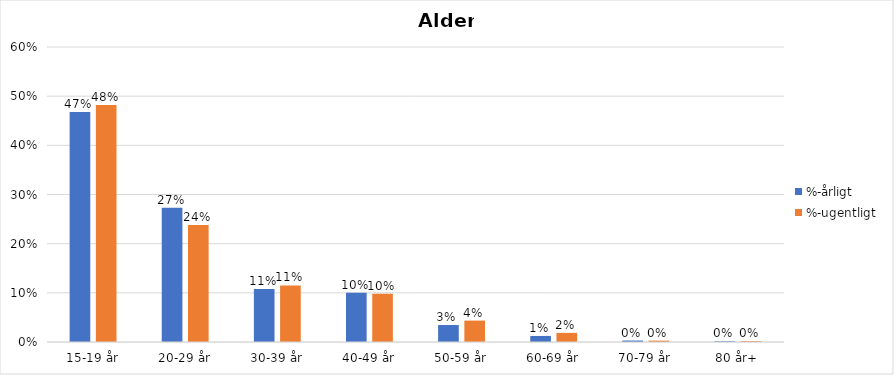
| Category | %-årligt | %-ugentligt |
|---|---|---|
| 15-19 år | 0.468 | 0.482 |
| 20-29 år | 0.273 | 0.238 |
| 30-39 år | 0.108 | 0.115 |
| 40-49 år | 0.1 | 0.098 |
| 50-59 år | 0.035 | 0.044 |
| 60-69 år | 0.012 | 0.019 |
| 70-79 år | 0.003 | 0.003 |
| 80 år+ | 0.002 | 0.002 |